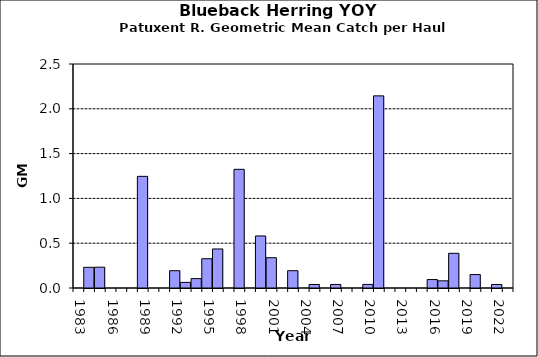
| Category | Series 0 |
|---|---|
| 1983.0 | 0 |
| 1984.0 | 0.231 |
| 1985.0 | 0.232 |
| 1986.0 | 0 |
| 1987.0 | 0 |
| 1988.0 | 0 |
| 1989.0 | 1.246 |
| 1990.0 | 0 |
| 1991.0 | 0 |
| 1992.0 | 0.193 |
| 1993.0 | 0.063 |
| 1994.0 | 0.105 |
| 1995.0 | 0.327 |
| 1996.0 | 0.436 |
| 1997.0 | 0 |
| 1998.0 | 1.325 |
| 1999.0 | 0 |
| 2000.0 | 0.581 |
| 2001.0 | 0.338 |
| 2002.0 | 0 |
| 2003.0 | 0.193 |
| 2004.0 | 0 |
| 2005.0 | 0.039 |
| 2006.0 | 0 |
| 2007.0 | 0.039 |
| 2008.0 | 0 |
| 2009.0 | 0 |
| 2010.0 | 0.04 |
| 2011.0 | 2.144 |
| 2012.0 | 0 |
| 2013.0 | 0 |
| 2014.0 | 0 |
| 2015.0 | 0 |
| 2016.0 | 0.094 |
| 2017.0 | 0.08 |
| 2018.0 | 0.387 |
| 2019.0 | 0 |
| 2020.0 | 0.15 |
| 2021.0 | 0 |
| 2022.0 | 0.039 |
| 2023.0 | 0 |